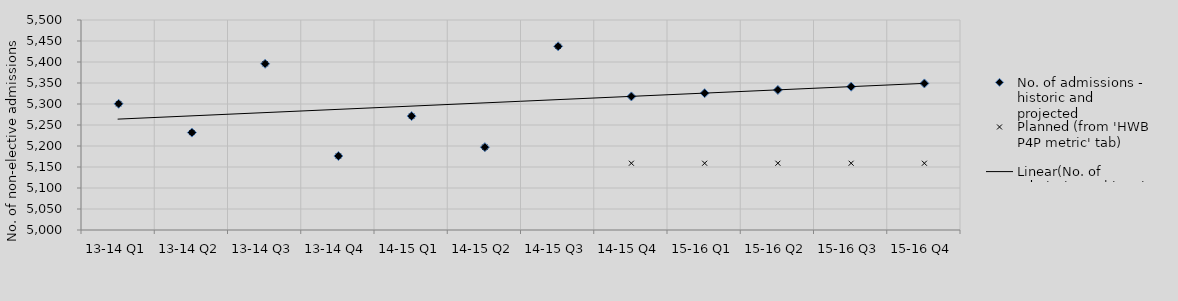
| Category | No. of admissions - historic and projected | Planned (from 'HWB P4P metric' tab) |
|---|---|---|
| 13-14 Q1 | 5300.503 | 5300.503 |
| 13-14 Q2 | 5231.985 | 5231.985 |
| 13-14 Q3 | 5395.743 | 5395.743 |
| 13-14 Q4 | 5176.184 | 5176.184 |
| 14-15 Q1 | 5271.227 | 5271.227 |
| 14-15 Q2 | 5197.255 | 5197.255 |
| 14-15 Q3 | 5437.318 | 5437.318 |
| 14-15 Q4 | 5318.098 | 5159 |
| 15-16 Q1 | 5325.829 | 5159 |
| 15-16 Q2 | 5333.56 | 5159 |
| 15-16 Q3 | 5341.291 | 5159 |
| 15-16 Q4 | 5349.022 | 5159 |